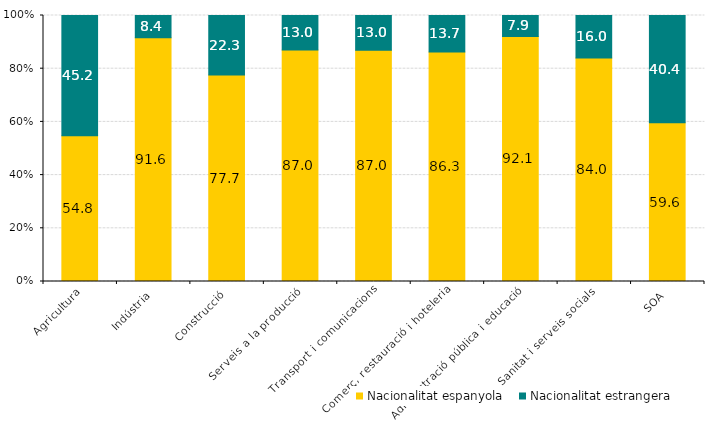
| Category | Nacionalitat espanyola | Nacionalitat estrangera |
|---|---|---|
| Agricultura | 54.779 | 45.221 |
| Indústria | 91.636 | 8.364 |
| Construcció | 77.676 | 22.324 |
| Serveis a la producció | 86.992 | 13.008 |
| Transport i comunicacions | 86.964 | 13.036 |
| Comerç, restauració i hoteleria | 86.252 | 13.748 |
| Administració pública i educació | 92.107 | 7.893 |
| Sanitat i serveis socials | 84.031 | 15.969 |
| SOA | 59.636 | 40.364 |